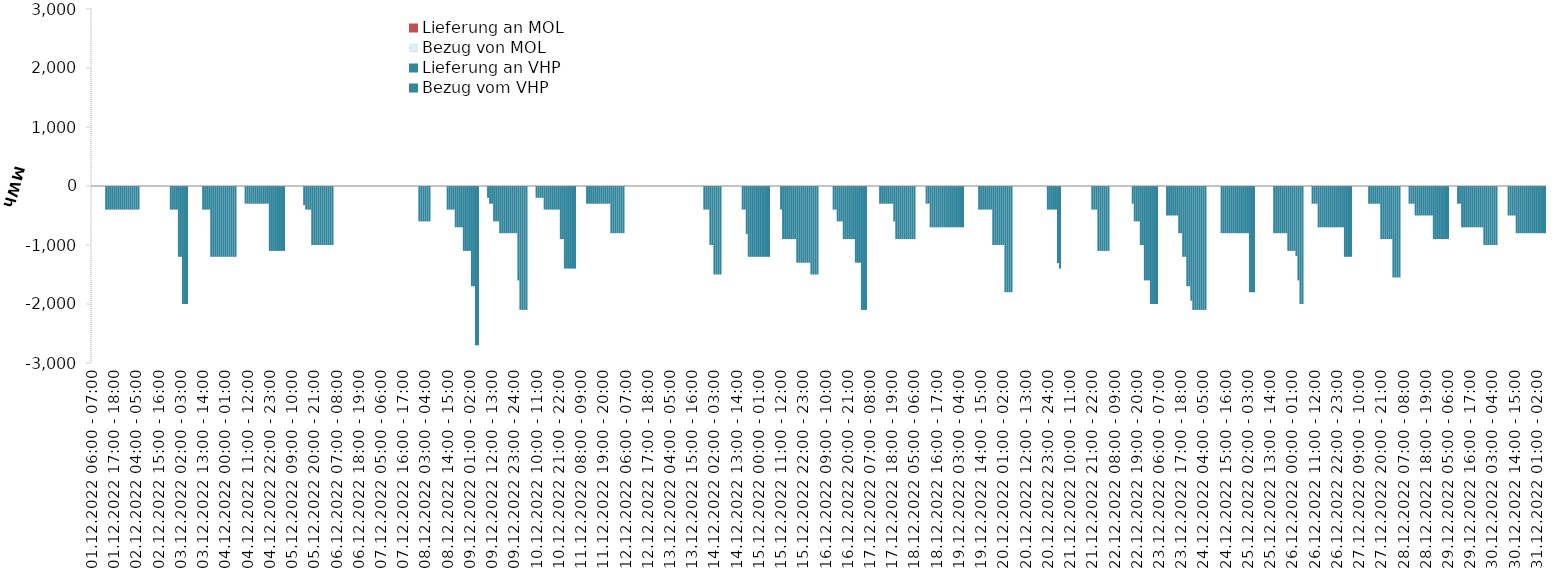
| Category | Bezug vom VHP | Lieferung an VHP | Bezug von MOL | Lieferung an MOL |
|---|---|---|---|---|
| 01.12.2022 06:00 - 07:00 | 0 | 0 | 0 | 0 |
| 01.12.2022 07:00 - 08:00 | 0 | 0 | 0 | 0 |
| 01.12.2022 08:00 - 09:00 | 0 | 0 | 0 | 0 |
| 01.12.2022 09:00 - 10:00 | 0 | 0 | 0 | 0 |
| 01.12.2022 10:00 - 11:00 | 0 | 0 | 0 | 0 |
| 01.12.2022 11:00 - 12:00 | 0 | 0 | 0 | 0 |
| 01.12.2022 12:00 - 13:00 | 0 | 0 | 0 | 0 |
| 01.12.2022 13:00 - 14:00 | 0 | -400 | 0 | 0 |
| 01.12.2022 14:00 - 15:00 | 0 | -400 | 0 | 0 |
| 01.12.2022 15:00 - 16:00 | 0 | -400 | 0 | 0 |
| 01.12.2022 16:00 - 17:00 | 0 | -400 | 0 | 0 |
| 01.12.2022 17:00 - 18:00 | 0 | -400 | 0 | 0 |
| 01.12.2022 18:00 - 19:00 | 0 | -400 | 0 | 0 |
| 01.12.2022 19:00 - 20:00 | 0 | -400 | 0 | 0 |
| 01.12.2022 20:00 - 21:00 | 0 | -400 | 0 | 0 |
| 01.12.2022 21:00 - 22:00 | 0 | -400 | 0 | 0 |
| 01.12.2022 22:00 - 23:00 | 0 | -400 | 0 | 0 |
| 01.12.2022 23:00 - 24:00 | 0 | -400 | 0 | 0 |
| 02.12.2022 00:00 - 01:00 | 0 | -400 | 0 | 0 |
| 02.12.2022 01:00 - 02:00 | 0 | -400 | 0 | 0 |
| 02.12.2022 02:00 - 03:00 | 0 | -400 | 0 | 0 |
| 02.12.2022 03:00 - 04:00 | 0 | -400 | 0 | 0 |
| 02.12.2022 04:00 - 05:00 | 0 | -400 | 0 | 0 |
| 02.12.2022 05:00 - 06:00 | 0 | -400 | 0 | 0 |
| 02.12.2022 06:00 - 07:00 | 0 | 0 | 0 | 0 |
| 02.12.2022 07:00 - 08:00 | 0 | 0 | 0 | 0 |
| 02.12.2022 08:00 - 09:00 | 0 | 0 | 0 | 0 |
| 02.12.2022 09:00 - 10:00 | 0 | 0 | 0 | 0 |
| 02.12.2022 10:00 - 11:00 | 0 | 0 | 0 | 0 |
| 02.12.2022 11:00 - 12:00 | 0 | 0 | 0 | 0 |
| 02.12.2022 12:00 - 13:00 | 0 | 0 | 0 | 0 |
| 02.12.2022 13:00 - 14:00 | 0 | 0 | 0 | 0 |
| 02.12.2022 14:00 - 15:00 | 0 | 0 | 0 | 0 |
| 02.12.2022 15:00 - 16:00 | 0 | 0 | 0 | 0 |
| 02.12.2022 16:00 - 17:00 | 0 | 0 | 0 | 0 |
| 02.12.2022 17:00 - 18:00 | 0 | 0 | 0 | 0 |
| 02.12.2022 18:00 - 19:00 | 0 | 0 | 0 | 0 |
| 02.12.2022 19:00 - 20:00 | 0 | 0 | 0 | 0 |
| 02.12.2022 20:00 - 21:00 | 0 | 0 | 0 | 0 |
| 02.12.2022 21:00 - 22:00 | 0 | -400 | 0 | 0 |
| 02.12.2022 22:00 - 23:00 | 0 | -400 | 0 | 0 |
| 02.12.2022 23:00 - 24:00 | 0 | -400 | 0 | 0 |
| 03.12.2022 00:00 - 01:00 | 0 | -400 | 0 | 0 |
| 03.12.2022 01:00 - 02:00 | 0 | -1200 | 0 | 0 |
| 03.12.2022 02:00 - 03:00 | 0 | -1200 | 0 | 0 |
| 03.12.2022 03:00 - 04:00 | 0 | -2000 | 0 | 0 |
| 03.12.2022 04:00 - 05:00 | 0 | -2000 | 0 | 0 |
| 03.12.2022 05:00 - 06:00 | 0 | -2000 | 0 | 0 |
| 03.12.2022 06:00 - 07:00 | 0 | 0 | 0 | 0 |
| 03.12.2022 07:00 - 08:00 | 0 | 0 | 0 | 0 |
| 03.12.2022 08:00 - 09:00 | 0 | 0 | 0 | 0 |
| 03.12.2022 09:00 - 10:00 | 0 | 0 | 0 | 0 |
| 03.12.2022 10:00 - 11:00 | 0 | 0 | 0 | 0 |
| 03.12.2022 11:00 - 12:00 | 0 | 0 | 0 | 0 |
| 03.12.2022 12:00 - 13:00 | 0 | 0 | 0 | 0 |
| 03.12.2022 13:00 - 14:00 | 0 | -400 | 0 | 0 |
| 03.12.2022 14:00 - 15:00 | 0 | -400 | 0 | 0 |
| 03.12.2022 15:00 - 16:00 | 0 | -400 | 0 | 0 |
| 03.12.2022 16:00 - 17:00 | 0 | -400 | 0 | 0 |
| 03.12.2022 17:00 - 18:00 | 0 | -1200 | 0 | 0 |
| 03.12.2022 18:00 - 19:00 | 0 | -1200 | 0 | 0 |
| 03.12.2022 19:00 - 20:00 | 0 | -1200 | 0 | 0 |
| 03.12.2022 20:00 - 21:00 | 0 | -1200 | 0 | 0 |
| 03.12.2022 21:00 - 22:00 | 0 | -1200 | 0 | 0 |
| 03.12.2022 22:00 - 23:00 | 0 | -1200 | 0 | 0 |
| 03.12.2022 23:00 - 24:00 | 0 | -1200 | 0 | 0 |
| 04.12.2022 00:00 - 01:00 | 0 | -1200 | 0 | 0 |
| 04.12.2022 01:00 - 02:00 | 0 | -1200 | 0 | 0 |
| 04.12.2022 02:00 - 03:00 | 0 | -1200 | 0 | 0 |
| 04.12.2022 03:00 - 04:00 | 0 | -1200 | 0 | 0 |
| 04.12.2022 04:00 - 05:00 | 0 | -1200 | 0 | 0 |
| 04.12.2022 05:00 - 06:00 | 0 | -1200 | 0 | 0 |
| 04.12.2022 06:00 - 07:00 | 0 | 0 | 0 | 0 |
| 04.12.2022 07:00 - 08:00 | 0 | 0 | 0 | 0 |
| 04.12.2022 08:00 - 09:00 | 0 | 0 | 0 | 0 |
| 04.12.2022 09:00 - 10:00 | 0 | 0 | 0 | 0 |
| 04.12.2022 10:00 - 11:00 | 0 | -300 | 0 | 0 |
| 04.12.2022 11:00 - 12:00 | 0 | -300 | 0 | 0 |
| 04.12.2022 12:00 - 13:00 | 0 | -300 | 0 | 0 |
| 04.12.2022 13:00 - 14:00 | 0 | -300 | 0 | 0 |
| 04.12.2022 14:00 - 15:00 | 0 | -300 | 0 | 0 |
| 04.12.2022 15:00 - 16:00 | 0 | -300 | 0 | 0 |
| 04.12.2022 16:00 - 17:00 | 0 | -300 | 0 | 0 |
| 04.12.2022 17:00 - 18:00 | 0 | -300 | 0 | 0 |
| 04.12.2022 18:00 - 19:00 | 0 | -300 | 0 | 0 |
| 04.12.2022 19:00 - 20:00 | 0 | -300 | 0 | 0 |
| 04.12.2022 20:00 - 21:00 | 0 | -300 | 0 | 0 |
| 04.12.2022 21:00 - 22:00 | 0 | -300 | 0 | 0 |
| 04.12.2022 22:00 - 23:00 | 0 | -1100 | 0 | 0 |
| 04.12.2022 23:00 - 24:00 | 0 | -1100 | 0 | 0 |
| 05.12.2022 00:00 - 01:00 | 0 | -1100 | 0 | 0 |
| 05.12.2022 01:00 - 02:00 | 0 | -1100 | 0 | 0 |
| 05.12.2022 02:00 - 03:00 | 0 | -1100 | 0 | 0 |
| 05.12.2022 03:00 - 04:00 | 0 | -1100 | 0 | 0 |
| 05.12.2022 04:00 - 05:00 | 0 | -1100 | 0 | 0 |
| 05.12.2022 05:00 - 06:00 | 0 | -1100 | 0 | 0 |
| 05.12.2022 06:00 - 07:00 | 0 | 0 | 0 | 0 |
| 05.12.2022 07:00 - 08:00 | 0 | 0 | 0 | 0 |
| 05.12.2022 08:00 - 09:00 | 0 | 0 | 0 | 0 |
| 05.12.2022 09:00 - 10:00 | 0 | 0 | 0 | 0 |
| 05.12.2022 10:00 - 11:00 | 0 | 0 | 0 | 0 |
| 05.12.2022 11:00 - 12:00 | 0 | 0 | 0 | 0 |
| 05.12.2022 12:00 - 13:00 | 0 | 0 | 0 | 0 |
| 05.12.2022 13:00 - 14:00 | 0 | 0 | 0 | 0 |
| 05.12.2022 14:00 - 15:00 | 0 | 0 | 0 | 0 |
| 05.12.2022 15:00 - 16:00 | 0 | -325 | 0 | 0 |
| 05.12.2022 16:00 - 17:00 | 0 | -400 | 0 | 0 |
| 05.12.2022 17:00 - 18:00 | 0 | -400 | 0 | 0 |
| 05.12.2022 18:00 - 19:00 | 0 | -400 | 0 | 0 |
| 05.12.2022 19:00 - 20:00 | 0 | -1000 | 0 | 0 |
| 05.12.2022 20:00 - 21:00 | 0 | -1000 | 0 | 0 |
| 05.12.2022 21:00 - 22:00 | 0 | -1000 | 0 | 0 |
| 05.12.2022 22:00 - 23:00 | 0 | -1000 | 0 | 0 |
| 05.12.2022 23:00 - 24:00 | 0 | -1000 | 0 | 0 |
| 06.12.2022 00:00 - 01:00 | 0 | -1000 | 0 | 0 |
| 06.12.2022 01:00 - 02:00 | 0 | -1000 | 0 | 0 |
| 06.12.2022 02:00 - 03:00 | 0 | -1000 | 0 | 0 |
| 06.12.2022 03:00 - 04:00 | 0 | -1000 | 0 | 0 |
| 06.12.2022 04:00 - 05:00 | 0 | -1000 | 0 | 0 |
| 06.12.2022 05:00 - 06:00 | 0 | -1000 | 0 | 0 |
| 06.12.2022 06:00 - 07:00 | 0 | 0 | 0 | 0 |
| 06.12.2022 07:00 - 08:00 | 0 | 0 | 0 | 0 |
| 06.12.2022 08:00 - 09:00 | 0 | 0 | 0 | 0 |
| 06.12.2022 09:00 - 10:00 | 0 | 0 | 0 | 0 |
| 06.12.2022 10:00 - 11:00 | 0 | 0 | 0 | 0 |
| 06.12.2022 11:00 - 12:00 | 0 | 0 | 0 | 0 |
| 06.12.2022 12:00 - 13:00 | 0 | 0 | 0 | 0 |
| 06.12.2022 13:00 - 14:00 | 0 | 0 | 0 | 0 |
| 06.12.2022 14:00 - 15:00 | 0 | 0 | 0 | 0 |
| 06.12.2022 15:00 - 16:00 | 0 | 0 | 0 | 0 |
| 06.12.2022 16:00 - 17:00 | 0 | 0 | 0 | 0 |
| 06.12.2022 17:00 - 18:00 | 0 | 0 | 0 | 0 |
| 06.12.2022 18:00 - 19:00 | 0 | 0 | 0 | 0 |
| 06.12.2022 19:00 - 20:00 | 0 | 0 | 0 | 0 |
| 06.12.2022 20:00 - 21:00 | 0 | 0 | 0 | 0 |
| 06.12.2022 21:00 - 22:00 | 0 | 0 | 0 | 0 |
| 06.12.2022 22:00 - 23:00 | 0 | 0 | 0 | 0 |
| 06.12.2022 23:00 - 24:00 | 0 | 0 | 0 | 0 |
| 07.12.2022 00:00 - 01:00 | 0 | 0 | 0 | 0 |
| 07.12.2022 01:00 - 02:00 | 0 | 0 | 0 | 0 |
| 07.12.2022 02:00 - 03:00 | 0 | 0 | 0 | 0 |
| 07.12.2022 03:00 - 04:00 | 0 | 0 | 0 | 0 |
| 07.12.2022 04:00 - 05:00 | 0 | 0 | 0 | 0 |
| 07.12.2022 05:00 - 06:00 | 0 | 0 | 0 | 0 |
| 07.12.2022 06:00 - 07:00 | 0 | 0 | 0 | 0 |
| 07.12.2022 07:00 - 08:00 | 0 | 0 | 0 | 0 |
| 07.12.2022 08:00 - 09:00 | 0 | 0 | 0 | 0 |
| 07.12.2022 09:00 - 10:00 | 0 | 0 | 0 | 0 |
| 07.12.2022 10:00 - 11:00 | 0 | 0 | 0 | 0 |
| 07.12.2022 11:00 - 12:00 | 0 | 0 | 0 | 0 |
| 07.12.2022 12:00 - 13:00 | 0 | 0 | 0 | 0 |
| 07.12.2022 13:00 - 14:00 | 0 | 0 | 0 | 0 |
| 07.12.2022 14:00 - 15:00 | 0 | 0 | 0 | 0 |
| 07.12.2022 15:00 - 16:00 | 0 | 0 | 0 | 0 |
| 07.12.2022 16:00 - 17:00 | 0 | 0 | 0 | 0 |
| 07.12.2022 17:00 - 18:00 | 0 | 0 | 0 | 0 |
| 07.12.2022 18:00 - 19:00 | 0 | 0 | 0 | 0 |
| 07.12.2022 19:00 - 20:00 | 0 | 0 | 0 | 0 |
| 07.12.2022 20:00 - 21:00 | 0 | 0 | 0 | 0 |
| 07.12.2022 21:00 - 22:00 | 0 | 0 | 0 | 0 |
| 07.12.2022 22:00 - 23:00 | 0 | 0 | 0 | 0 |
| 07.12.2022 23:00 - 24:00 | 0 | 0 | 0 | 0 |
| 08.12.2022 00:00 - 01:00 | 0 | -600 | 0 | 0 |
| 08.12.2022 01:00 - 02:00 | 0 | -600 | 0 | 0 |
| 08.12.2022 02:00 - 03:00 | 0 | -600 | 0 | 0 |
| 08.12.2022 03:00 - 04:00 | 0 | -600 | 0 | 0 |
| 08.12.2022 04:00 - 05:00 | 0 | -600 | 0 | 0 |
| 08.12.2022 05:00 - 06:00 | 0 | -600 | 0 | 0 |
| 08.12.2022 06:00 - 07:00 | 0 | 0 | 0 | 0 |
| 08.12.2022 07:00 - 08:00 | 0 | 0 | 0 | 0 |
| 08.12.2022 08:00 - 09:00 | 0 | 0 | 0 | 0 |
| 08.12.2022 09:00 - 10:00 | 0 | 0 | 0 | 0 |
| 08.12.2022 10:00 - 11:00 | 0 | 0 | 0 | 0 |
| 08.12.2022 11:00 - 12:00 | 0 | 0 | 0 | 0 |
| 08.12.2022 12:00 - 13:00 | 0 | 0 | 0 | 0 |
| 08.12.2022 13:00 - 14:00 | 0 | 0 | 0 | 0 |
| 08.12.2022 14:00 - 15:00 | 0 | -400 | 0 | 0 |
| 08.12.2022 15:00 - 16:00 | 0 | -400 | 0 | 0 |
| 08.12.2022 16:00 - 17:00 | 0 | -400 | 0 | 0 |
| 08.12.2022 17:00 - 18:00 | 0 | -400 | 0 | 0 |
| 08.12.2022 18:00 - 19:00 | 0 | -700 | 0 | 0 |
| 08.12.2022 19:00 - 20:00 | 0 | -700 | 0 | 0 |
| 08.12.2022 20:00 - 21:00 | 0 | -700 | 0 | 0 |
| 08.12.2022 21:00 - 22:00 | 0 | -700 | 0 | 0 |
| 08.12.2022 22:00 - 23:00 | 0 | -1100 | 0 | 0 |
| 08.12.2022 23:00 - 24:00 | 0 | -1100 | 0 | 0 |
| 09.12.2022 00:00 - 01:00 | 0 | -1100 | 0 | 0 |
| 09.12.2022 01:00 - 02:00 | 0 | -1100 | 0 | 0 |
| 09.12.2022 02:00 - 03:00 | 0 | -1700 | 0 | 0 |
| 09.12.2022 03:00 - 04:00 | 0 | -1700 | 0 | 0 |
| 09.12.2022 04:00 - 05:00 | 0 | -2700 | 0 | 0 |
| 09.12.2022 05:00 - 06:00 | 0 | -2700 | 0 | 0 |
| 09.12.2022 06:00 - 07:00 | 0 | 0 | 0 | 0 |
| 09.12.2022 07:00 - 08:00 | 0 | 0 | 0 | 0 |
| 09.12.2022 08:00 - 09:00 | 0 | 0 | 0 | 0 |
| 09.12.2022 09:00 - 10:00 | 0 | 0 | 0 | 0 |
| 09.12.2022 10:00 - 11:00 | 0 | -200 | 0 | 0 |
| 09.12.2022 11:00 - 12:00 | 0 | -300 | 0 | 0 |
| 09.12.2022 12:00 - 13:00 | 0 | -300 | 0 | 0 |
| 09.12.2022 13:00 - 14:00 | 0 | -600 | 0 | 0 |
| 09.12.2022 14:00 - 15:00 | 0 | -600 | 0 | 0 |
| 09.12.2022 15:00 - 16:00 | 0 | -600 | 0 | 0 |
| 09.12.2022 16:00 - 17:00 | 0 | -800 | 0 | 0 |
| 09.12.2022 17:00 - 18:00 | 0 | -800 | 0 | 0 |
| 09.12.2022 18:00 - 19:00 | 0 | -800 | 0 | 0 |
| 09.12.2022 19:00 - 20:00 | 0 | -800 | 0 | 0 |
| 09.12.2022 20:00 - 21:00 | 0 | -800 | 0 | 0 |
| 09.12.2022 21:00 - 22:00 | 0 | -800 | 0 | 0 |
| 09.12.2022 22:00 - 23:00 | 0 | -800 | 0 | 0 |
| 09.12.2022 23:00 - 24:00 | 0 | -800 | 0 | 0 |
| 10.12.2022 00:00 - 01:00 | 0 | -800 | 0 | 0 |
| 10.12.2022 01:00 - 02:00 | 0 | -1600 | 0 | 0 |
| 10.12.2022 02:00 - 03:00 | 0 | -2100 | 0 | 0 |
| 10.12.2022 03:00 - 04:00 | 0 | -2100 | 0 | 0 |
| 10.12.2022 04:00 - 05:00 | 0 | -2100 | 0 | 0 |
| 10.12.2022 05:00 - 06:00 | 0 | -2100 | 0 | 0 |
| 10.12.2022 06:00 - 07:00 | 0 | 0 | 0 | 0 |
| 10.12.2022 07:00 - 08:00 | 0 | 0 | 0 | 0 |
| 10.12.2022 08:00 - 09:00 | 0 | 0 | 0 | 0 |
| 10.12.2022 09:00 - 10:00 | 0 | 0 | 0 | 0 |
| 10.12.2022 10:00 - 11:00 | 0 | -200 | 0 | 0 |
| 10.12.2022 11:00 - 12:00 | 0 | -200 | 0 | 0 |
| 10.12.2022 12:00 - 13:00 | 0 | -200 | 0 | 0 |
| 10.12.2022 13:00 - 14:00 | 0 | -200 | 0 | 0 |
| 10.12.2022 14:00 - 15:00 | 0 | -400 | 0 | 0 |
| 10.12.2022 15:00 - 16:00 | 0 | -400 | 0 | 0 |
| 10.12.2022 16:00 - 17:00 | 0 | -400 | 0 | 0 |
| 10.12.2022 17:00 - 18:00 | 0 | -400 | 0 | 0 |
| 10.12.2022 18:00 - 19:00 | 0 | -400 | 0 | 0 |
| 10.12.2022 19:00 - 20:00 | 0 | -400 | 0 | 0 |
| 10.12.2022 20:00 - 21:00 | 0 | -400 | 0 | 0 |
| 10.12.2022 21:00 - 22:00 | 0 | -400 | 0 | 0 |
| 10.12.2022 22:00 - 23:00 | 0 | -900 | 0 | 0 |
| 10.12.2022 23:00 - 24:00 | 0 | -900 | 0 | 0 |
| 11.12.2022 00:00 - 01:00 | 0 | -1400 | 0 | 0 |
| 11.12.2022 01:00 - 02:00 | 0 | -1400 | 0 | 0 |
| 11.12.2022 02:00 - 03:00 | 0 | -1400 | 0 | 0 |
| 11.12.2022 03:00 - 04:00 | 0 | -1400 | 0 | 0 |
| 11.12.2022 04:00 - 05:00 | 0 | -1400 | 0 | 0 |
| 11.12.2022 05:00 - 06:00 | 0 | -1400 | 0 | 0 |
| 11.12.2022 06:00 - 07:00 | 0 | 0 | 0 | 0 |
| 11.12.2022 07:00 - 08:00 | 0 | 0 | 0 | 0 |
| 11.12.2022 08:00 - 09:00 | 0 | 0 | 0 | 0 |
| 11.12.2022 09:00 - 10:00 | 0 | 0 | 0 | 0 |
| 11.12.2022 10:00 - 11:00 | 0 | 0 | 0 | 0 |
| 11.12.2022 11:00 - 12:00 | 0 | -300 | 0 | 0 |
| 11.12.2022 12:00 - 13:00 | 0 | -300 | 0 | 0 |
| 11.12.2022 13:00 - 14:00 | 0 | -300 | 0 | 0 |
| 11.12.2022 14:00 - 15:00 | 0 | -300 | 0 | 0 |
| 11.12.2022 15:00 - 16:00 | 0 | -300 | 0 | 0 |
| 11.12.2022 16:00 - 17:00 | 0 | -300 | 0 | 0 |
| 11.12.2022 17:00 - 18:00 | 0 | -300 | 0 | 0 |
| 11.12.2022 18:00 - 19:00 | 0 | -300 | 0 | 0 |
| 11.12.2022 19:00 - 20:00 | 0 | -300 | 0 | 0 |
| 11.12.2022 20:00 - 21:00 | 0 | -300 | 0 | 0 |
| 11.12.2022 21:00 - 22:00 | 0 | -300 | 0 | 0 |
| 11.12.2022 22:00 - 23:00 | 0 | -300 | 0 | 0 |
| 11.12.2022 23:00 - 24:00 | 0 | -800 | 0 | 0 |
| 12.12.2022 00:00 - 01:00 | 0 | -800 | 0 | 0 |
| 12.12.2022 01:00 - 02:00 | 0 | -800 | 0 | 0 |
| 12.12.2022 02:00 - 03:00 | 0 | -800 | 0 | 0 |
| 12.12.2022 03:00 - 04:00 | 0 | -800 | 0 | 0 |
| 12.12.2022 04:00 - 05:00 | 0 | -800 | 0 | 0 |
| 12.12.2022 05:00 - 06:00 | 0 | -800 | 0 | 0 |
| 12.12.2022 06:00 - 07:00 | 0 | 0 | 0 | 0 |
| 12.12.2022 07:00 - 08:00 | 0 | 0 | 0 | 0 |
| 12.12.2022 08:00 - 09:00 | 0 | 0 | 0 | 0 |
| 12.12.2022 09:00 - 10:00 | 0 | 0 | 0 | 0 |
| 12.12.2022 10:00 - 11:00 | 0 | 0 | 0 | 0 |
| 12.12.2022 11:00 - 12:00 | 0 | 0 | 0 | 0 |
| 12.12.2022 12:00 - 13:00 | 0 | 0 | 0 | 0 |
| 12.12.2022 13:00 - 14:00 | 0 | 0 | 0 | 0 |
| 12.12.2022 14:00 - 15:00 | 0 | 0 | 0 | 0 |
| 12.12.2022 15:00 - 16:00 | 0 | 0 | 0 | 0 |
| 12.12.2022 16:00 - 17:00 | 0 | 0 | 0 | 0 |
| 12.12.2022 17:00 - 18:00 | 0 | 0 | 0 | 0 |
| 12.12.2022 18:00 - 19:00 | 0 | 0 | 0 | 0 |
| 12.12.2022 19:00 - 20:00 | 0 | 0 | 0 | 0 |
| 12.12.2022 20:00 - 21:00 | 0 | 0 | 0 | 0 |
| 12.12.2022 21:00 - 22:00 | 0 | 0 | 0 | 0 |
| 12.12.2022 22:00 - 23:00 | 0 | 0 | 0 | 0 |
| 12.12.2022 23:00 - 24:00 | 0 | 0 | 0 | 0 |
| 13.12.2022 00:00 - 01:00 | 0 | 0 | 0 | 0 |
| 13.12.2022 01:00 - 02:00 | 0 | 0 | 0 | 0 |
| 13.12.2022 02:00 - 03:00 | 0 | 0 | 0 | 0 |
| 13.12.2022 03:00 - 04:00 | 0 | 0 | 0 | 0 |
| 13.12.2022 04:00 - 05:00 | 0 | 0 | 0 | 0 |
| 13.12.2022 05:00 - 06:00 | 0 | 0 | 0 | 0 |
| 13.12.2022 06:00 - 07:00 | 0 | 0 | 0 | 0 |
| 13.12.2022 07:00 - 08:00 | 0 | 0 | 0 | 0 |
| 13.12.2022 08:00 - 09:00 | 0 | 0 | 0 | 0 |
| 13.12.2022 09:00 - 10:00 | 0 | 0 | 0 | 0 |
| 13.12.2022 10:00 - 11:00 | 0 | 0 | 0 | 0 |
| 13.12.2022 11:00 - 12:00 | 0 | 0 | 0 | 0 |
| 13.12.2022 12:00 - 13:00 | 0 | 0 | 0 | 0 |
| 13.12.2022 13:00 - 14:00 | 0 | 0 | 0 | 0 |
| 13.12.2022 14:00 - 15:00 | 0 | 0 | 0 | 0 |
| 13.12.2022 15:00 - 16:00 | 0 | 0 | 0 | 0 |
| 13.12.2022 16:00 - 17:00 | 0 | 0 | 0 | 0 |
| 13.12.2022 17:00 - 18:00 | 0 | 0 | 0 | 0 |
| 13.12.2022 18:00 - 19:00 | 0 | 0 | 0 | 0 |
| 13.12.2022 19:00 - 20:00 | 0 | 0 | 0 | 0 |
| 13.12.2022 20:00 - 21:00 | 0 | 0 | 0 | 0 |
| 13.12.2022 21:00 - 22:00 | 0 | -400 | 0 | 0 |
| 13.12.2022 22:00 - 23:00 | 0 | -400 | 0 | 0 |
| 13.12.2022 23:00 - 24:00 | 0 | -400 | 0 | 0 |
| 14.12.2022 00:00 - 01:00 | 0 | -1000 | 0 | 0 |
| 14.12.2022 01:00 - 02:00 | 0 | -1000 | 0 | 0 |
| 14.12.2022 02:00 - 03:00 | 0 | -1500 | 0 | 0 |
| 14.12.2022 03:00 - 04:00 | 0 | -1500 | 0 | 0 |
| 14.12.2022 04:00 - 05:00 | 0 | -1500 | 0 | 0 |
| 14.12.2022 05:00 - 06:00 | 0 | -1500 | 0 | 0 |
| 14.12.2022 06:00 - 07:00 | 0 | 0 | 0 | 0 |
| 14.12.2022 07:00 - 08:00 | 0 | 0 | 0 | 0 |
| 14.12.2022 08:00 - 09:00 | 0 | 0 | 0 | 0 |
| 14.12.2022 09:00 - 10:00 | 0 | 0 | 0 | 0 |
| 14.12.2022 10:00 - 11:00 | 0 | 0 | 0 | 0 |
| 14.12.2022 11:00 - 12:00 | 0 | 0 | 0 | 0 |
| 14.12.2022 12:00 - 13:00 | 0 | 0 | 0 | 0 |
| 14.12.2022 13:00 - 14:00 | 0 | 0 | 0 | 0 |
| 14.12.2022 14:00 - 15:00 | 0 | 0 | 0 | 0 |
| 14.12.2022 15:00 - 16:00 | 0 | 0 | 0 | 0 |
| 14.12.2022 16:00 - 17:00 | 0 | -400 | 0 | 0 |
| 14.12.2022 17:00 - 18:00 | 0 | -400 | 0 | 0 |
| 14.12.2022 18:00 - 19:00 | 0 | -812 | 0 | 0 |
| 14.12.2022 19:00 - 20:00 | 0 | -1200 | 0 | 0 |
| 14.12.2022 20:00 - 21:00 | 0 | -1200 | 0 | 0 |
| 14.12.2022 21:00 - 22:00 | 0 | -1200 | 0 | 0 |
| 14.12.2022 22:00 - 23:00 | 0 | -1200 | 0 | 0 |
| 14.12.2022 23:00 - 24:00 | 0 | -1200 | 0 | 0 |
| 15.12.2022 00:00 - 01:00 | 0 | -1200 | 0 | 0 |
| 15.12.2022 01:00 - 02:00 | 0 | -1200 | 0 | 0 |
| 15.12.2022 02:00 - 03:00 | 0 | -1200 | 0 | 0 |
| 15.12.2022 03:00 - 04:00 | 0 | -1200 | 0 | 0 |
| 15.12.2022 04:00 - 05:00 | 0 | -1200 | 0 | 0 |
| 15.12.2022 05:00 - 06:00 | 0 | -1200 | 0 | 0 |
| 15.12.2022 06:00 - 07:00 | 0 | 0 | 0 | 0 |
| 15.12.2022 07:00 - 08:00 | 0 | 0 | 0 | 0 |
| 15.12.2022 08:00 - 09:00 | 0 | 0 | 0 | 0 |
| 15.12.2022 09:00 - 10:00 | 0 | 0 | 0 | 0 |
| 15.12.2022 10:00 - 11:00 | 0 | 0 | 0 | 0 |
| 15.12.2022 11:00 - 12:00 | 0 | -400 | 0 | 0 |
| 15.12.2022 12:00 - 13:00 | 0 | -900 | 0 | 0 |
| 15.12.2022 13:00 - 14:00 | 0 | -900 | 0 | 0 |
| 15.12.2022 14:00 - 15:00 | 0 | -900 | 0 | 0 |
| 15.12.2022 15:00 - 16:00 | 0 | -900 | 0 | 0 |
| 15.12.2022 16:00 - 17:00 | 0 | -900 | 0 | 0 |
| 15.12.2022 17:00 - 18:00 | 0 | -900 | 0 | 0 |
| 15.12.2022 18:00 - 19:00 | 0 | -900 | 0 | 0 |
| 15.12.2022 19:00 - 20:00 | 0 | -1300 | 0 | 0 |
| 15.12.2022 20:00 - 21:00 | 0 | -1300 | 0 | 0 |
| 15.12.2022 21:00 - 22:00 | 0 | -1300 | 0 | 0 |
| 15.12.2022 22:00 - 23:00 | 0 | -1300 | 0 | 0 |
| 15.12.2022 23:00 - 24:00 | 0 | -1300 | 0 | 0 |
| 16.12.2022 00:00 - 01:00 | 0 | -1300 | 0 | 0 |
| 16.12.2022 01:00 - 02:00 | 0 | -1300 | 0 | 0 |
| 16.12.2022 02:00 - 03:00 | 0 | -1500 | 0 | 0 |
| 16.12.2022 03:00 - 04:00 | 0 | -1500 | 0 | 0 |
| 16.12.2022 04:00 - 05:00 | 0 | -1500 | 0 | 0 |
| 16.12.2022 05:00 - 06:00 | 0 | -1500 | 0 | 0 |
| 16.12.2022 06:00 - 07:00 | 0 | 0 | 0 | 0 |
| 16.12.2022 07:00 - 08:00 | 0 | 0 | 0 | 0 |
| 16.12.2022 08:00 - 09:00 | 0 | 0 | 0 | 0 |
| 16.12.2022 09:00 - 10:00 | 0 | 0 | 0 | 0 |
| 16.12.2022 10:00 - 11:00 | 0 | 0 | 0 | 0 |
| 16.12.2022 11:00 - 12:00 | 0 | 0 | 0 | 0 |
| 16.12.2022 12:00 - 13:00 | 0 | 0 | 0 | 0 |
| 16.12.2022 13:00 - 14:00 | 0 | -400 | 0 | 0 |
| 16.12.2022 14:00 - 15:00 | 0 | -400 | 0 | 0 |
| 16.12.2022 15:00 - 16:00 | 0 | -600 | 0 | 0 |
| 16.12.2022 16:00 - 17:00 | 0 | -600 | 0 | 0 |
| 16.12.2022 17:00 - 18:00 | 0 | -600 | 0 | 0 |
| 16.12.2022 18:00 - 19:00 | 0 | -900 | 0 | 0 |
| 16.12.2022 19:00 - 20:00 | 0 | -900 | 0 | 0 |
| 16.12.2022 20:00 - 21:00 | 0 | -900 | 0 | 0 |
| 16.12.2022 21:00 - 22:00 | 0 | -900 | 0 | 0 |
| 16.12.2022 22:00 - 23:00 | 0 | -900 | 0 | 0 |
| 16.12.2022 23:00 - 24:00 | 0 | -900 | 0 | 0 |
| 17.12.2022 00:00 - 01:00 | 0 | -1300 | 0 | 0 |
| 17.12.2022 01:00 - 02:00 | 0 | -1300 | 0 | 0 |
| 17.12.2022 02:00 - 03:00 | 0 | -1300 | 0 | 0 |
| 17.12.2022 03:00 - 04:00 | 0 | -2100 | 0 | 0 |
| 17.12.2022 04:00 - 05:00 | 0 | -2100 | 0 | 0 |
| 17.12.2022 05:00 - 06:00 | 0 | -2100 | 0 | 0 |
| 17.12.2022 06:00 - 07:00 | 0 | 0 | 0 | 0 |
| 17.12.2022 07:00 - 08:00 | 0 | 0 | 0 | 0 |
| 17.12.2022 08:00 - 09:00 | 0 | 0 | 0 | 0 |
| 17.12.2022 09:00 - 10:00 | 0 | 0 | 0 | 0 |
| 17.12.2022 10:00 - 11:00 | 0 | 0 | 0 | 0 |
| 17.12.2022 11:00 - 12:00 | 0 | 0 | 0 | 0 |
| 17.12.2022 12:00 - 13:00 | 0 | -300 | 0 | 0 |
| 17.12.2022 13:00 - 14:00 | 0 | -300 | 0 | 0 |
| 17.12.2022 14:00 - 15:00 | 0 | -300 | 0 | 0 |
| 17.12.2022 15:00 - 16:00 | 0 | -300 | 0 | 0 |
| 17.12.2022 16:00 - 17:00 | 0 | -300 | 0 | 0 |
| 17.12.2022 17:00 - 18:00 | 0 | -300 | 0 | 0 |
| 17.12.2022 18:00 - 19:00 | 0 | -300 | 0 | 0 |
| 17.12.2022 19:00 - 20:00 | 0 | -600 | 0 | 0 |
| 17.12.2022 20:00 - 21:00 | 0 | -900 | 0 | 0 |
| 17.12.2022 21:00 - 22:00 | 0 | -900 | 0 | 0 |
| 17.12.2022 22:00 - 23:00 | 0 | -900 | 0 | 0 |
| 17.12.2022 23:00 - 24:00 | 0 | -900 | 0 | 0 |
| 18.12.2022 00:00 - 01:00 | 0 | -900 | 0 | 0 |
| 18.12.2022 01:00 - 02:00 | 0 | -900 | 0 | 0 |
| 18.12.2022 02:00 - 03:00 | 0 | -900 | 0 | 0 |
| 18.12.2022 03:00 - 04:00 | 0 | -900 | 0 | 0 |
| 18.12.2022 04:00 - 05:00 | 0 | -900 | 0 | 0 |
| 18.12.2022 05:00 - 06:00 | 0 | -900 | 0 | 0 |
| 18.12.2022 06:00 - 07:00 | 0 | 0 | 0 | 0 |
| 18.12.2022 07:00 - 08:00 | 0 | 0 | 0 | 0 |
| 18.12.2022 08:00 - 09:00 | 0 | 0 | 0 | 0 |
| 18.12.2022 09:00 - 10:00 | 0 | 0 | 0 | 0 |
| 18.12.2022 10:00 - 11:00 | 0 | 0 | 0 | 0 |
| 18.12.2022 11:00 - 12:00 | 0 | -300 | 0 | 0 |
| 18.12.2022 12:00 - 13:00 | 0 | -300 | 0 | 0 |
| 18.12.2022 13:00 - 14:00 | 0 | -700 | 0 | 0 |
| 18.12.2022 14:00 - 15:00 | 0 | -700 | 0 | 0 |
| 18.12.2022 15:00 - 16:00 | 0 | -700 | 0 | 0 |
| 18.12.2022 16:00 - 17:00 | 0 | -700 | 0 | 0 |
| 18.12.2022 17:00 - 18:00 | 0 | -700 | 0 | 0 |
| 18.12.2022 18:00 - 19:00 | 0 | -700 | 0 | 0 |
| 18.12.2022 19:00 - 20:00 | 0 | -700 | 0 | 0 |
| 18.12.2022 20:00 - 21:00 | 0 | -700 | 0 | 0 |
| 18.12.2022 21:00 - 22:00 | 0 | -700 | 0 | 0 |
| 18.12.2022 22:00 - 23:00 | 0 | -700 | 0 | 0 |
| 18.12.2022 23:00 - 24:00 | 0 | -700 | 0 | 0 |
| 19.12.2022 00:00 - 01:00 | 0 | -700 | 0 | 0 |
| 19.12.2022 01:00 - 02:00 | 0 | -700 | 0 | 0 |
| 19.12.2022 02:00 - 03:00 | 0 | -700 | 0 | 0 |
| 19.12.2022 03:00 - 04:00 | 0 | -700 | 0 | 0 |
| 19.12.2022 04:00 - 05:00 | 0 | -700 | 0 | 0 |
| 19.12.2022 05:00 - 06:00 | 0 | -700 | 0 | 0 |
| 19.12.2022 06:00 - 07:00 | 0 | 0 | 0 | 0 |
| 19.12.2022 07:00 - 08:00 | 0 | 0 | 0 | 0 |
| 19.12.2022 08:00 - 09:00 | 0 | 0 | 0 | 0 |
| 19.12.2022 09:00 - 10:00 | 0 | 0 | 0 | 0 |
| 19.12.2022 10:00 - 11:00 | 0 | 0 | 0 | 0 |
| 19.12.2022 11:00 - 12:00 | 0 | 0 | 0 | 0 |
| 19.12.2022 12:00 - 13:00 | 0 | 0 | 0 | 0 |
| 19.12.2022 13:00 - 14:00 | 0 | -400 | 0 | 0 |
| 19.12.2022 14:00 - 15:00 | 0 | -400 | 0 | 0 |
| 19.12.2022 15:00 - 16:00 | 0 | -400 | 0 | 0 |
| 19.12.2022 16:00 - 17:00 | 0 | -400 | 0 | 0 |
| 19.12.2022 17:00 - 18:00 | 0 | -400 | 0 | 0 |
| 19.12.2022 18:00 - 19:00 | 0 | -400 | 0 | 0 |
| 19.12.2022 19:00 - 20:00 | 0 | -400 | 0 | 0 |
| 19.12.2022 20:00 - 21:00 | 0 | -1000 | 0 | 0 |
| 19.12.2022 21:00 - 22:00 | 0 | -1000 | 0 | 0 |
| 19.12.2022 22:00 - 23:00 | 0 | -1000 | 0 | 0 |
| 19.12.2022 23:00 - 24:00 | 0 | -1000 | 0 | 0 |
| 20.12.2022 00:00 - 01:00 | 0 | -1000 | 0 | 0 |
| 20.12.2022 01:00 - 02:00 | 0 | -1000 | 0 | 0 |
| 20.12.2022 02:00 - 03:00 | 0 | -1800 | 0 | 0 |
| 20.12.2022 03:00 - 04:00 | 0 | -1800 | 0 | 0 |
| 20.12.2022 04:00 - 05:00 | 0 | -1800 | 0 | 0 |
| 20.12.2022 05:00 - 06:00 | 0 | -1800 | 0 | 0 |
| 20.12.2022 06:00 - 07:00 | 0 | 0 | 0 | 0 |
| 20.12.2022 07:00 - 08:00 | 0 | 0 | 0 | 0 |
| 20.12.2022 08:00 - 09:00 | 0 | 0 | 0 | 0 |
| 20.12.2022 09:00 - 10:00 | 0 | 0 | 0 | 0 |
| 20.12.2022 10:00 - 11:00 | 0 | 0 | 0 | 0 |
| 20.12.2022 11:00 - 12:00 | 0 | 0 | 0 | 0 |
| 20.12.2022 12:00 - 13:00 | 0 | 0 | 0 | 0 |
| 20.12.2022 13:00 - 14:00 | 0 | 0 | 0 | 0 |
| 20.12.2022 14:00 - 15:00 | 0 | 0 | 0 | 0 |
| 20.12.2022 15:00 - 16:00 | 0 | 0 | 0 | 0 |
| 20.12.2022 16:00 - 17:00 | 0 | 0 | 0 | 0 |
| 20.12.2022 17:00 - 18:00 | 0 | 0 | 0 | 0 |
| 20.12.2022 18:00 - 19:00 | 0 | 0 | 0 | 0 |
| 20.12.2022 19:00 - 20:00 | 0 | 0 | 0 | 0 |
| 20.12.2022 20:00 - 21:00 | 0 | 0 | 0 | 0 |
| 20.12.2022 21:00 - 22:00 | 0 | 0 | 0 | 0 |
| 20.12.2022 22:00 - 23:00 | 0 | 0 | 0 | 0 |
| 20.12.2022 23:00 - 24:00 | 0 | -400 | 0 | 0 |
| 21.12.2022 00:00 - 01:00 | 0 | -400 | 0 | 0 |
| 21.12.2022 01:00 - 02:00 | 0 | -400 | 0 | 0 |
| 21.12.2022 02:00 - 03:00 | 0 | -400 | 0 | 0 |
| 21.12.2022 03:00 - 04:00 | 0 | -400 | 0 | 0 |
| 21.12.2022 04:00 - 05:00 | 0 | -1306 | 0 | 0 |
| 21.12.2022 05:00 - 06:00 | 0 | -1400 | 0 | 0 |
| 21.12.2022 06:00 - 07:00 | 0 | 0 | 0 | 0 |
| 21.12.2022 07:00 - 08:00 | 0 | 0 | 0 | 0 |
| 21.12.2022 08:00 - 09:00 | 0 | 0 | 0 | 0 |
| 21.12.2022 09:00 - 10:00 | 0 | 0 | 0 | 0 |
| 21.12.2022 10:00 - 11:00 | 0 | 0 | 0 | 0 |
| 21.12.2022 11:00 - 12:00 | 0 | 0 | 0 | 0 |
| 21.12.2022 12:00 - 13:00 | 0 | 0 | 0 | 0 |
| 21.12.2022 13:00 - 14:00 | 0 | 0 | 0 | 0 |
| 21.12.2022 14:00 - 15:00 | 0 | 0 | 0 | 0 |
| 21.12.2022 15:00 - 16:00 | 0 | 0 | 0 | 0 |
| 21.12.2022 16:00 - 17:00 | 0 | 0 | 0 | 0 |
| 21.12.2022 17:00 - 18:00 | 0 | 0 | 0 | 0 |
| 21.12.2022 18:00 - 19:00 | 0 | 0 | 0 | 0 |
| 21.12.2022 19:00 - 20:00 | 0 | 0 | 0 | 0 |
| 21.12.2022 20:00 - 21:00 | 0 | 0 | 0 | 0 |
| 21.12.2022 21:00 - 22:00 | 0 | -400 | 0 | 0 |
| 21.12.2022 22:00 - 23:00 | 0 | -400 | 0 | 0 |
| 21.12.2022 23:00 - 24:00 | 0 | -400 | 0 | 0 |
| 22.12.2022 00:00 - 01:00 | 0 | -1100 | 0 | 0 |
| 22.12.2022 01:00 - 02:00 | 0 | -1100 | 0 | 0 |
| 22.12.2022 02:00 - 03:00 | 0 | -1100 | 0 | 0 |
| 22.12.2022 03:00 - 04:00 | 0 | -1100 | 0 | 0 |
| 22.12.2022 04:00 - 05:00 | 0 | -1100 | 0 | 0 |
| 22.12.2022 05:00 - 06:00 | 0 | -1100 | 0 | 0 |
| 22.12.2022 06:00 - 07:00 | 0 | 0 | 0 | 0 |
| 22.12.2022 07:00 - 08:00 | 0 | 0 | 0 | 0 |
| 22.12.2022 08:00 - 09:00 | 0 | 0 | 0 | 0 |
| 22.12.2022 09:00 - 10:00 | 0 | 0 | 0 | 0 |
| 22.12.2022 10:00 - 11:00 | 0 | 0 | 0 | 0 |
| 22.12.2022 11:00 - 12:00 | 0 | 0 | 0 | 0 |
| 22.12.2022 12:00 - 13:00 | 0 | 0 | 0 | 0 |
| 22.12.2022 13:00 - 14:00 | 0 | 0 | 0 | 0 |
| 22.12.2022 14:00 - 15:00 | 0 | 0 | 0 | 0 |
| 22.12.2022 15:00 - 16:00 | 0 | 0 | 0 | 0 |
| 22.12.2022 16:00 - 17:00 | 0 | 0 | 0 | 0 |
| 22.12.2022 17:00 - 18:00 | 0 | -300 | 0 | 0 |
| 22.12.2022 18:00 - 19:00 | 0 | -600 | 0 | 0 |
| 22.12.2022 19:00 - 20:00 | 0 | -600 | 0 | 0 |
| 22.12.2022 20:00 - 21:00 | 0 | -600 | 0 | 0 |
| 22.12.2022 21:00 - 22:00 | 0 | -1000 | 0 | 0 |
| 22.12.2022 22:00 - 23:00 | 0 | -1000 | 0 | 0 |
| 22.12.2022 23:00 - 24:00 | 0 | -1600 | 0 | 0 |
| 23.12.2022 00:00 - 01:00 | 0 | -1600 | 0 | 0 |
| 23.12.2022 01:00 - 02:00 | 0 | -1600 | 0 | 0 |
| 23.12.2022 02:00 - 03:00 | 0 | -2000 | 0 | 0 |
| 23.12.2022 03:00 - 04:00 | 0 | -2000 | 0 | 0 |
| 23.12.2022 04:00 - 05:00 | 0 | -2000 | 0 | 0 |
| 23.12.2022 05:00 - 06:00 | 0 | -2000 | 0 | 0 |
| 23.12.2022 06:00 - 07:00 | 0 | 0 | 0 | 0 |
| 23.12.2022 07:00 - 08:00 | 0 | 0 | 0 | 0 |
| 23.12.2022 08:00 - 09:00 | 0 | 0 | 0 | 0 |
| 23.12.2022 09:00 - 10:00 | 0 | 0 | 0 | 0 |
| 23.12.2022 10:00 - 11:00 | 0 | -500 | 0 | 0 |
| 23.12.2022 11:00 - 12:00 | 0 | -500 | 0 | 0 |
| 23.12.2022 12:00 - 13:00 | 0 | -500 | 0 | 0 |
| 23.12.2022 13:00 - 14:00 | 0 | -500 | 0 | 0 |
| 23.12.2022 14:00 - 15:00 | 0 | -500 | 0 | 0 |
| 23.12.2022 15:00 - 16:00 | 0 | -500 | 0 | 0 |
| 23.12.2022 16:00 - 17:00 | 0 | -800 | 0 | 0 |
| 23.12.2022 17:00 - 18:00 | 0 | -800 | 0 | 0 |
| 23.12.2022 18:00 - 19:00 | 0 | -1200 | 0 | 0 |
| 23.12.2022 19:00 - 20:00 | 0 | -1200 | 0 | 0 |
| 23.12.2022 20:00 - 21:00 | 0 | -1700 | 0 | 0 |
| 23.12.2022 21:00 - 22:00 | 0 | -1700 | 0 | 0 |
| 23.12.2022 22:00 - 23:00 | 0 | -1944 | 0 | 0 |
| 23.12.2022 23:00 - 24:00 | 0 | -2100 | 0 | 0 |
| 24.12.2022 00:00 - 01:00 | 0 | -2100 | 0 | 0 |
| 24.12.2022 01:00 - 02:00 | 0 | -2100 | 0 | 0 |
| 24.12.2022 02:00 - 03:00 | 0 | -2100 | 0 | 0 |
| 24.12.2022 03:00 - 04:00 | 0 | -2100 | 0 | 0 |
| 24.12.2022 04:00 - 05:00 | 0 | -2100 | 0 | 0 |
| 24.12.2022 05:00 - 06:00 | 0 | -2100 | 0 | 0 |
| 24.12.2022 06:00 - 07:00 | 0 | 0 | 0 | 0 |
| 24.12.2022 07:00 - 08:00 | 0 | 0 | 0 | 0 |
| 24.12.2022 08:00 - 09:00 | 0 | 0 | 0 | 0 |
| 24.12.2022 09:00 - 10:00 | 0 | 0 | 0 | 0 |
| 24.12.2022 10:00 - 11:00 | 0 | 0 | 0 | 0 |
| 24.12.2022 11:00 - 12:00 | 0 | 0 | 0 | 0 |
| 24.12.2022 12:00 - 13:00 | 0 | 0 | 0 | 0 |
| 24.12.2022 13:00 - 14:00 | 0 | -800 | 0 | 0 |
| 24.12.2022 14:00 - 15:00 | 0 | -800 | 0 | 0 |
| 24.12.2022 15:00 - 16:00 | 0 | -800 | 0 | 0 |
| 24.12.2022 16:00 - 17:00 | 0 | -800 | 0 | 0 |
| 24.12.2022 17:00 - 18:00 | 0 | -800 | 0 | 0 |
| 24.12.2022 18:00 - 19:00 | 0 | -800 | 0 | 0 |
| 24.12.2022 19:00 - 20:00 | 0 | -800 | 0 | 0 |
| 24.12.2022 20:00 - 21:00 | 0 | -800 | 0 | 0 |
| 24.12.2022 21:00 - 22:00 | 0 | -800 | 0 | 0 |
| 24.12.2022 22:00 - 23:00 | 0 | -800 | 0 | 0 |
| 24.12.2022 23:00 - 24:00 | 0 | -800 | 0 | 0 |
| 25.12.2022 00:00 - 01:00 | 0 | -800 | 0 | 0 |
| 25.12.2022 01:00 - 02:00 | 0 | -800 | 0 | 0 |
| 25.12.2022 02:00 - 03:00 | 0 | -800 | 0 | 0 |
| 25.12.2022 03:00 - 04:00 | 0 | -1800 | 0 | 0 |
| 25.12.2022 04:00 - 05:00 | 0 | -1800 | 0 | 0 |
| 25.12.2022 05:00 - 06:00 | 0 | -1800 | 0 | 0 |
| 25.12.2022 06:00 - 07:00 | 0 | 0 | 0 | 0 |
| 25.12.2022 07:00 - 08:00 | 0 | 0 | 0 | 0 |
| 25.12.2022 08:00 - 09:00 | 0 | 0 | 0 | 0 |
| 25.12.2022 09:00 - 10:00 | 0 | 0 | 0 | 0 |
| 25.12.2022 10:00 - 11:00 | 0 | 0 | 0 | 0 |
| 25.12.2022 11:00 - 12:00 | 0 | 0 | 0 | 0 |
| 25.12.2022 12:00 - 13:00 | 0 | 0 | 0 | 0 |
| 25.12.2022 13:00 - 14:00 | 0 | 0 | 0 | 0 |
| 25.12.2022 14:00 - 15:00 | 0 | 0 | 0 | 0 |
| 25.12.2022 15:00 - 16:00 | 0 | -800 | 0 | 0 |
| 25.12.2022 16:00 - 17:00 | 0 | -800 | 0 | 0 |
| 25.12.2022 17:00 - 18:00 | 0 | -800 | 0 | 0 |
| 25.12.2022 18:00 - 19:00 | 0 | -800 | 0 | 0 |
| 25.12.2022 19:00 - 20:00 | 0 | -800 | 0 | 0 |
| 25.12.2022 20:00 - 21:00 | 0 | -800 | 0 | 0 |
| 25.12.2022 21:00 - 22:00 | 0 | -800 | 0 | 0 |
| 25.12.2022 22:00 - 23:00 | 0 | -1100 | 0 | 0 |
| 25.12.2022 23:00 - 24:00 | 0 | -1100 | 0 | 0 |
| 26.12.2022 00:00 - 01:00 | 0 | -1100 | 0 | 0 |
| 26.12.2022 01:00 - 02:00 | 0 | -1100 | 0 | 0 |
| 26.12.2022 02:00 - 03:00 | 0 | -1188 | 0 | 0 |
| 26.12.2022 03:00 - 04:00 | 0 | -1600 | 0 | 0 |
| 26.12.2022 04:00 - 05:00 | 0 | -2000 | 0 | 0 |
| 26.12.2022 05:00 - 06:00 | 0 | -2000 | 0 | 0 |
| 26.12.2022 06:00 - 07:00 | 0 | 0 | 0 | 0 |
| 26.12.2022 07:00 - 08:00 | 0 | 0 | 0 | 0 |
| 26.12.2022 08:00 - 09:00 | 0 | 0 | 0 | 0 |
| 26.12.2022 09:00 - 10:00 | 0 | 0 | 0 | 0 |
| 26.12.2022 10:00 - 11:00 | 0 | -300 | 0 | 0 |
| 26.12.2022 11:00 - 12:00 | 0 | -300 | 0 | 0 |
| 26.12.2022 12:00 - 13:00 | 0 | -300 | 0 | 0 |
| 26.12.2022 13:00 - 14:00 | 0 | -700 | 0 | 0 |
| 26.12.2022 14:00 - 15:00 | 0 | -700 | 0 | 0 |
| 26.12.2022 15:00 - 16:00 | 0 | -700 | 0 | 0 |
| 26.12.2022 16:00 - 17:00 | 0 | -700 | 0 | 0 |
| 26.12.2022 17:00 - 18:00 | 0 | -700 | 0 | 0 |
| 26.12.2022 18:00 - 19:00 | 0 | -700 | 0 | 0 |
| 26.12.2022 19:00 - 20:00 | 0 | -700 | 0 | 0 |
| 26.12.2022 20:00 - 21:00 | 0 | -700 | 0 | 0 |
| 26.12.2022 21:00 - 22:00 | 0 | -700 | 0 | 0 |
| 26.12.2022 22:00 - 23:00 | 0 | -700 | 0 | 0 |
| 26.12.2022 23:00 - 24:00 | 0 | -700 | 0 | 0 |
| 27.12.2022 00:00 - 01:00 | 0 | -700 | 0 | 0 |
| 27.12.2022 01:00 - 02:00 | 0 | -700 | 0 | 0 |
| 27.12.2022 02:00 - 03:00 | 0 | -1200 | 0 | 0 |
| 27.12.2022 03:00 - 04:00 | 0 | -1200 | 0 | 0 |
| 27.12.2022 04:00 - 05:00 | 0 | -1200 | 0 | 0 |
| 27.12.2022 05:00 - 06:00 | 0 | -1200 | 0 | 0 |
| 27.12.2022 06:00 - 07:00 | 0 | 0 | 0 | 0 |
| 27.12.2022 07:00 - 08:00 | 0 | 0 | 0 | 0 |
| 27.12.2022 08:00 - 09:00 | 0 | 0 | 0 | 0 |
| 27.12.2022 09:00 - 10:00 | 0 | 0 | 0 | 0 |
| 27.12.2022 10:00 - 11:00 | 0 | 0 | 0 | 0 |
| 27.12.2022 11:00 - 12:00 | 0 | 0 | 0 | 0 |
| 27.12.2022 12:00 - 13:00 | 0 | 0 | 0 | 0 |
| 27.12.2022 13:00 - 14:00 | 0 | 0 | 0 | 0 |
| 27.12.2022 14:00 - 15:00 | 0 | -300 | 0 | 0 |
| 27.12.2022 15:00 - 16:00 | 0 | -300 | 0 | 0 |
| 27.12.2022 16:00 - 17:00 | 0 | -300 | 0 | 0 |
| 27.12.2022 17:00 - 18:00 | 0 | -300 | 0 | 0 |
| 27.12.2022 18:00 - 19:00 | 0 | -300 | 0 | 0 |
| 27.12.2022 19:00 - 20:00 | 0 | -300 | 0 | 0 |
| 27.12.2022 20:00 - 21:00 | 0 | -900 | 0 | 0 |
| 27.12.2022 21:00 - 22:00 | 0 | -900 | 0 | 0 |
| 27.12.2022 22:00 - 23:00 | 0 | -900 | 0 | 0 |
| 27.12.2022 23:00 - 24:00 | 0 | -900 | 0 | 0 |
| 28.12.2022 00:00 - 01:00 | 0 | -900 | 0 | 0 |
| 28.12.2022 01:00 - 02:00 | 0 | -900 | 0 | 0 |
| 28.12.2022 02:00 - 03:00 | 0 | -1550 | 0 | 0 |
| 28.12.2022 03:00 - 04:00 | 0 | -1550 | 0 | 0 |
| 28.12.2022 04:00 - 05:00 | 0 | -1550 | 0 | 0 |
| 28.12.2022 05:00 - 06:00 | 0 | -1550 | 0 | 0 |
| 28.12.2022 06:00 - 07:00 | 0 | 0 | 0 | 0 |
| 28.12.2022 07:00 - 08:00 | 0 | 0 | 0 | 0 |
| 28.12.2022 08:00 - 09:00 | 0 | 0 | 0 | 0 |
| 28.12.2022 09:00 - 10:00 | 0 | 0 | 0 | 0 |
| 28.12.2022 10:00 - 11:00 | 0 | -300 | 0 | 0 |
| 28.12.2022 11:00 - 12:00 | 0 | -300 | 0 | 0 |
| 28.12.2022 12:00 - 13:00 | 0 | -300 | 0 | 0 |
| 28.12.2022 13:00 - 14:00 | 0 | -500 | 0 | 0 |
| 28.12.2022 14:00 - 15:00 | 0 | -500 | 0 | 0 |
| 28.12.2022 15:00 - 16:00 | 0 | -500 | 0 | 0 |
| 28.12.2022 16:00 - 17:00 | 0 | -500 | 0 | 0 |
| 28.12.2022 17:00 - 18:00 | 0 | -500 | 0 | 0 |
| 28.12.2022 18:00 - 19:00 | 0 | -500 | 0 | 0 |
| 28.12.2022 19:00 - 20:00 | 0 | -500 | 0 | 0 |
| 28.12.2022 20:00 - 21:00 | 0 | -500 | 0 | 0 |
| 28.12.2022 21:00 - 22:00 | 0 | -500 | 0 | 0 |
| 28.12.2022 22:00 - 23:00 | 0 | -900 | 0 | 0 |
| 28.12.2022 23:00 - 24:00 | 0 | -900 | 0 | 0 |
| 29.12.2022 00:00 - 01:00 | 0 | -900 | 0 | 0 |
| 29.12.2022 01:00 - 02:00 | 0 | -900 | 0 | 0 |
| 29.12.2022 02:00 - 03:00 | 0 | -900 | 0 | 0 |
| 29.12.2022 03:00 - 04:00 | 0 | -900 | 0 | 0 |
| 29.12.2022 04:00 - 05:00 | 0 | -900 | 0 | 0 |
| 29.12.2022 05:00 - 06:00 | 0 | -900 | 0 | 0 |
| 29.12.2022 06:00 - 07:00 | 0 | 0 | 0 | 0 |
| 29.12.2022 07:00 - 08:00 | 0 | 0 | 0 | 0 |
| 29.12.2022 08:00 - 09:00 | 0 | 0 | 0 | 0 |
| 29.12.2022 09:00 - 10:00 | 0 | 0 | 0 | 0 |
| 29.12.2022 10:00 - 11:00 | 0 | -300 | 0 | 0 |
| 29.12.2022 11:00 - 12:00 | 0 | -300 | 0 | 0 |
| 29.12.2022 12:00 - 13:00 | 0 | -700 | 0 | 0 |
| 29.12.2022 13:00 - 14:00 | 0 | -700 | 0 | 0 |
| 29.12.2022 14:00 - 15:00 | 0 | -700 | 0 | 0 |
| 29.12.2022 15:00 - 16:00 | 0 | -700 | 0 | 0 |
| 29.12.2022 16:00 - 17:00 | 0 | -700 | 0 | 0 |
| 29.12.2022 17:00 - 18:00 | 0 | -700 | 0 | 0 |
| 29.12.2022 18:00 - 19:00 | 0 | -700 | 0 | 0 |
| 29.12.2022 19:00 - 20:00 | 0 | -700 | 0 | 0 |
| 29.12.2022 20:00 - 21:00 | 0 | -700 | 0 | 0 |
| 29.12.2022 21:00 - 22:00 | 0 | -700 | 0 | 0 |
| 29.12.2022 22:00 - 23:00 | 0 | -700 | 0 | 0 |
| 29.12.2022 23:00 - 24:00 | 0 | -1000 | 0 | 0 |
| 30.12.2022 00:00 - 01:00 | 0 | -1000 | 0 | 0 |
| 30.12.2022 01:00 - 02:00 | 0 | -1000 | 0 | 0 |
| 30.12.2022 02:00 - 03:00 | 0 | -1000 | 0 | 0 |
| 30.12.2022 03:00 - 04:00 | 0 | -1000 | 0 | 0 |
| 30.12.2022 04:00 - 05:00 | 0 | -1000 | 0 | 0 |
| 30.12.2022 05:00 - 06:00 | 0 | -1000 | 0 | 0 |
| 30.12.2022 06:00 - 07:00 | 0 | 0 | 0 | 0 |
| 30.12.2022 07:00 - 08:00 | 0 | 0 | 0 | 0 |
| 30.12.2022 08:00 - 09:00 | 0 | 0 | 0 | 0 |
| 30.12.2022 09:00 - 10:00 | 0 | 0 | 0 | 0 |
| 30.12.2022 10:00 - 11:00 | 0 | 0 | 0 | 0 |
| 30.12.2022 11:00 - 12:00 | 0 | -500 | 0 | 0 |
| 30.12.2022 12:00 - 13:00 | 0 | -500 | 0 | 0 |
| 30.12.2022 13:00 - 14:00 | 0 | -500 | 0 | 0 |
| 30.12.2022 14:00 - 15:00 | 0 | -500 | 0 | 0 |
| 30.12.2022 15:00 - 16:00 | 0 | -800 | 0 | 0 |
| 30.12.2022 16:00 - 17:00 | 0 | -800 | 0 | 0 |
| 30.12.2022 17:00 - 18:00 | 0 | -800 | 0 | 0 |
| 30.12.2022 18:00 - 19:00 | 0 | -800 | 0 | 0 |
| 30.12.2022 19:00 - 20:00 | 0 | -800 | 0 | 0 |
| 30.12.2022 20:00 - 21:00 | 0 | -800 | 0 | 0 |
| 30.12.2022 21:00 - 22:00 | 0 | -800 | 0 | 0 |
| 30.12.2022 22:00 - 23:00 | 0 | -800 | 0 | 0 |
| 30.12.2022 23:00 - 24:00 | 0 | -800 | 0 | 0 |
| 31.12.2022 00:00 - 01:00 | 0 | -800 | 0 | 0 |
| 31.12.2022 01:00 - 02:00 | 0 | -800 | 0 | 0 |
| 31.12.2022 02:00 - 03:00 | 0 | -800 | 0 | 0 |
| 31.12.2022 03:00 - 04:00 | 0 | -800 | 0 | 0 |
| 31.12.2022 04:00 - 05:00 | 0 | -800 | 0 | 0 |
| 31.12.2022 05:00 - 06:00 | 0 | -800 | 0 | 0 |